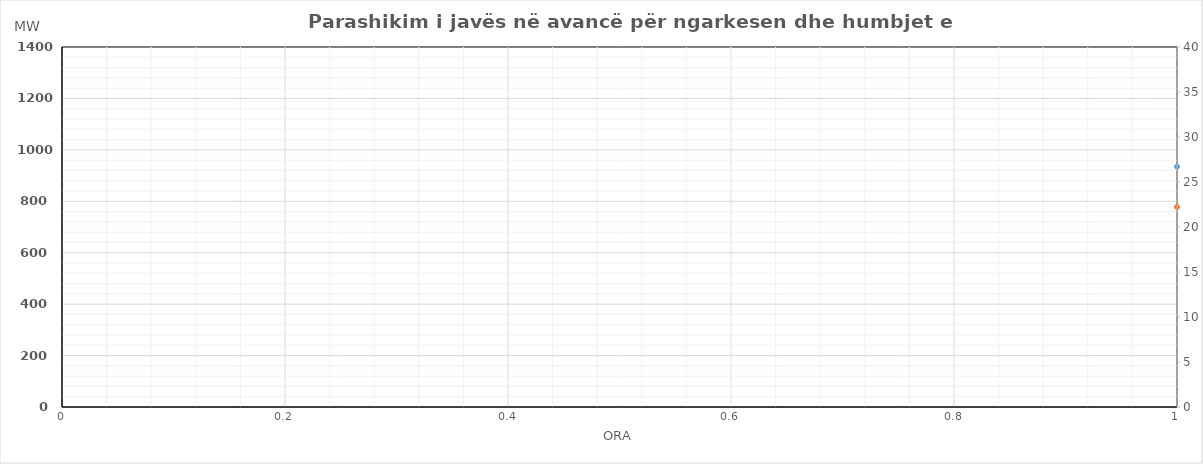
| Category | Ngarkesa (MWh) |
|---|---|
| 0 | 777.97 |
| 1 | 672.674 |
| 2 | 582.407 |
| 3 | 520.718 |
| 4 | 496.641 |
| 5 | 506.053 |
| 6 | 557.947 |
| 7 | 641.718 |
| 8 | 776.178 |
| 9 | 858.556 |
| 10 | 881.259 |
| 11 | 868.565 |
| 12 | 839.991 |
| 13 | 819.253 |
| 14 | 809.923 |
| 15 | 824.63 |
| 16 | 915.705 |
| 17 | 1025.215 |
| 18 | 1010.561 |
| 19 | 1003.517 |
| 20 | 967.272 |
| 21 | 908.2 |
| 22 | 819.345 |
| 23 | 703.429 |
| 24 | 687.999 |
| 25 | 592.925 |
| 26 | 521.657 |
| 27 | 484.111 |
| 28 | 472.354 |
| 29 | 491.123 |
| 30 | 546.479 |
| 31 | 661.163 |
| 32 | 801.186 |
| 33 | 877.394 |
| 34 | 883.519 |
| 35 | 856.564 |
| 36 | 837.601 |
| 37 | 827.35 |
| 38 | 823.776 |
| 39 | 845.142 |
| 40 | 931.501 |
| 41 | 1029.944 |
| 42 | 1032.202 |
| 43 | 1017.93 |
| 44 | 990.499 |
| 45 | 927.939 |
| 46 | 825.44 |
| 47 | 706.07 |
| 48 | 616.006 |
| 49 | 542.181 |
| 50 | 504.602 |
| 51 | 485.637 |
| 52 | 484.868 |
| 53 | 520.854 |
| 54 | 602.007 |
| 55 | 749.576 |
| 56 | 902.658 |
| 57 | 970.419 |
| 58 | 962.07 |
| 59 | 932.692 |
| 60 | 919.712 |
| 61 | 926.529 |
| 62 | 925.531 |
| 63 | 956.873 |
| 64 | 1034.16 |
| 65 | 1127.9 |
| 66 | 1130.766 |
| 67 | 1116.62 |
| 68 | 1092.054 |
| 69 | 1012.595 |
| 70 | 885.508 |
| 71 | 753.625 |
| 72 | 639.357 |
| 73 | 565.514 |
| 74 | 541.372 |
| 75 | 527.312 |
| 76 | 532.791 |
| 77 | 567.077 |
| 78 | 657.902 |
| 79 | 814.36 |
| 80 | 983.195 |
| 81 | 1046.315 |
| 82 | 1044.414 |
| 83 | 1015.399 |
| 84 | 1005.05 |
| 85 | 1019.686 |
| 86 | 1015.918 |
| 87 | 1052.07 |
| 88 | 1119.505 |
| 89 | 1209.798 |
| 90 | 1210.268 |
| 91 | 1193.144 |
| 92 | 1168.006 |
| 93 | 1073.854 |
| 94 | 937.563 |
| 95 | 783.441 |
| 96 | 672.032 |
| 97 | 565.844 |
| 98 | 520.769 |
| 99 | 504.189 |
| 100 | 509.873 |
| 101 | 557.316 |
| 102 | 710.184 |
| 103 | 895.035 |
| 104 | 1065.221 |
| 105 | 1107.149 |
| 106 | 1074.092 |
| 107 | 1031.424 |
| 108 | 1028.711 |
| 109 | 1033.062 |
| 110 | 1036.637 |
| 111 | 1049.947 |
| 112 | 1116.827 |
| 113 | 1246.542 |
| 114 | 1265.087 |
| 115 | 1235.572 |
| 116 | 1206.467 |
| 117 | 1103.751 |
| 118 | 974.927 |
| 119 | 786.528 |
| 120 | 655.049 |
| 121 | 565.564 |
| 122 | 520.487 |
| 123 | 511.851 |
| 124 | 520.362 |
| 125 | 572.647 |
| 126 | 725.442 |
| 127 | 946.074 |
| 128 | 1090.202 |
| 129 | 1113.962 |
| 130 | 1077.363 |
| 131 | 1036.514 |
| 132 | 1023.855 |
| 133 | 1037.031 |
| 134 | 1040.748 |
| 135 | 1056.295 |
| 136 | 1130.088 |
| 137 | 1246.066 |
| 138 | 1262.476 |
| 139 | 1247.367 |
| 140 | 1201.895 |
| 141 | 1100.429 |
| 142 | 949.408 |
| 143 | 768.64 |
| 144 | 642.352 |
| 145 | 574.675 |
| 146 | 542.211 |
| 147 | 533.741 |
| 148 | 540.203 |
| 149 | 599.431 |
| 150 | 740.684 |
| 151 | 958.778 |
| 152 | 1100.053 |
| 153 | 1110.834 |
| 154 | 1055.203 |
| 155 | 1024.897 |
| 156 | 1007.964 |
| 157 | 1010.388 |
| 158 | 1025.331 |
| 159 | 1043.044 |
| 160 | 1127.334 |
| 161 | 1254.742 |
| 162 | 1263.651 |
| 163 | 1251.985 |
| 164 | 1214.259 |
| 165 | 1102.595 |
| 166 | 964.041 |
| 167 | 811.392 |